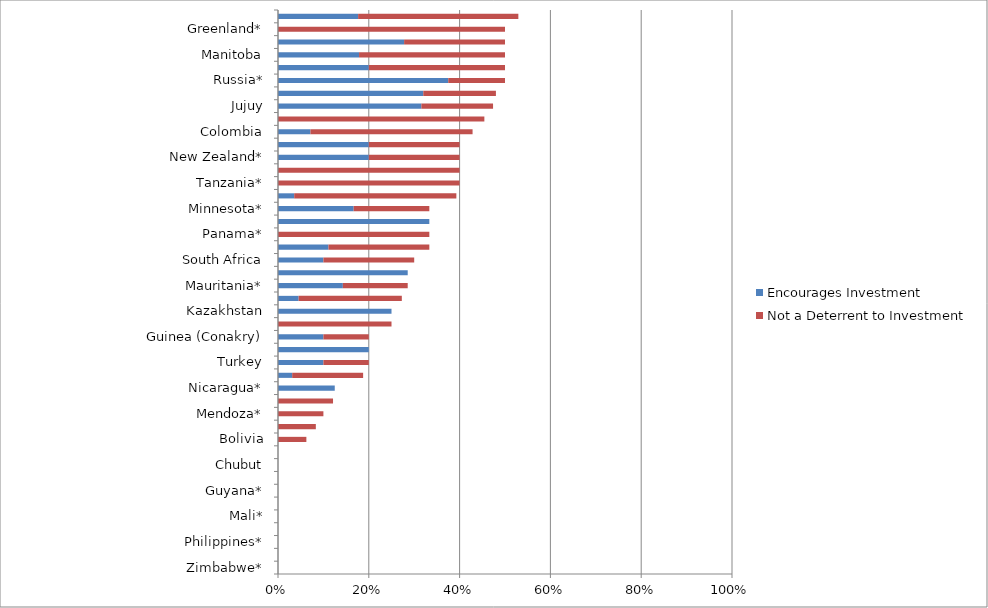
| Category | Encourages Investment | Not a Deterrent to Investment |
|---|---|---|
| Zimbabwe* | 0 | 0 |
| Venezuela* | 0 | 0 |
| Philippines* | 0 | 0 |
| Mongolia* | 0 | 0 |
| Mali* | 0 | 0 |
| Liberia* | 0 | 0 |
| Guyana* | 0 | 0 |
| Democratic Republic of Congo (DRC)* | 0 | 0 |
| Chubut | 0 | 0 |
| Burkina Faso* | 0 | 0 |
| Bolivia | 0 | 0.062 |
| Indonesia | 0 | 0.083 |
| Mendoza* | 0 | 0.1 |
| Peru | 0 | 0.121 |
| Nicaragua* | 0.125 | 0 |
| Mexico | 0.031 | 0.156 |
| Turkey | 0.1 | 0.1 |
| Kyrgyzstan* | 0.2 | 0 |
| Guinea (Conakry) | 0.1 | 0.1 |
| Papua New Guinea | 0 | 0.25 |
| Kazakhstan | 0.25 | 0 |
| Brazil | 0.045 | 0.227 |
| Mauritania* | 0.143 | 0.143 |
| China* | 0.286 | 0 |
| South Africa | 0.1 | 0.2 |
| Santa Cruz | 0.111 | 0.222 |
| Panama* | 0 | 0.333 |
| Niger* | 0.333 | 0 |
| Minnesota* | 0.167 | 0.167 |
| Chile | 0.036 | 0.357 |
| Tanzania* | 0 | 0.4 |
| Spain* | 0 | 0.4 |
| New Zealand* | 0.2 | 0.2 |
| Michigan* | 0.2 | 0.2 |
| Colombia | 0.071 | 0.357 |
| Ghana | 0 | 0.455 |
| Jujuy | 0.316 | 0.158 |
| San Juan | 0.32 | 0.16 |
| Russia* | 0.375 | 0.125 |
| Rio Negro* | 0.2 | 0.3 |
| Manitoba | 0.179 | 0.321 |
| La Rioja | 0.278 | 0.222 |
| Greenland* | 0 | 0.5 |
| Catamarca | 0.176 | 0.353 |